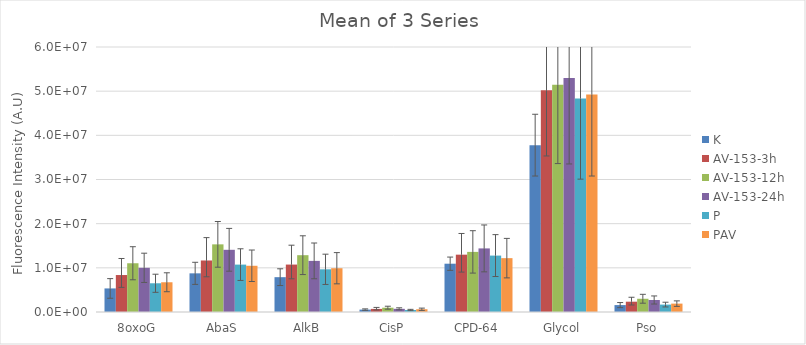
| Category | K | AV-153-3h  | AV-153-12h | AV-153-24h  | P  | PAV  |
|---|---|---|---|---|---|---|
| 8oxoG | 5337770.667 | 8370266 | 11037718.333 | 10002981 | 6504853.667 | 6732672 |
| AbaS | 8753230.167 | 11664979.167 | 15316415 | 14082833 | 10729865.833 | 10467406.167 |
| AlkB | 7885738.5 | 10738470.167 | 12864779.833 | 11572490.667 | 9665881.333 | 9912442.167 |
| CisP | 541308.833 | 701566.833 | 973555.333 | 719648 | 450687.667 | 622673.833 |
| CPD-64 | 10935094.833 | 12980771.167 | 13609865.167 | 14398386.167 | 12774014.833 | 12193507.333 |
| Glycol | 37779662.833 | 50199972 | 51444963.667 | 52975449.833 | 48319826.5 | 49261079 |
| Pso | 1564265.333 | 2333229.333 | 2997424.333 | 2720859.5 | 1676436 | 1898594 |